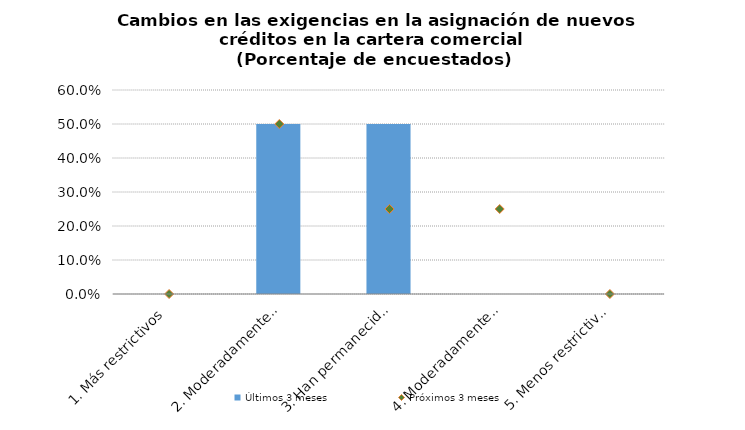
| Category | Últimos 3 meses |
|---|---|
| 1. Más restrictivos | 0 |
| 2. Moderadamente más restrictivos | 0.5 |
| 3. Han permanecido igual | 0.5 |
| 4. Moderadamente menos restrictivos | 0 |
| 5. Menos restrictivos | 0 |